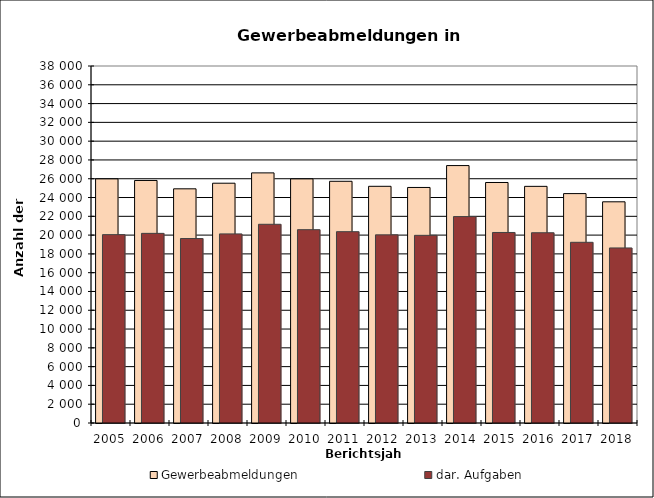
| Category | Gewerbeabmeldungen | dar. Aufgaben |
|---|---|---|
| 2005.0 | 25984 | 20051 |
| 2006.0 | 25816 | 20185 |
| 2007.0 | 24926 | 19635 |
| 2008.0 | 25523 | 20128 |
| 2009.0 | 26623 | 21151 |
| 2010.0 | 25984 | 20578 |
| 2011.0 | 25729 | 20364 |
| 2012.0 | 25195 | 20027 |
| 2013.0 | 25071 | 19975 |
| 2014.0 | 27402 | 21971 |
| 2015.0 | 25601 | 20280 |
| 2016.0 | 25189 | 20252 |
| 2017.0 | 24417 | 19234 |
| 2018.0 | 23545 | 18633 |